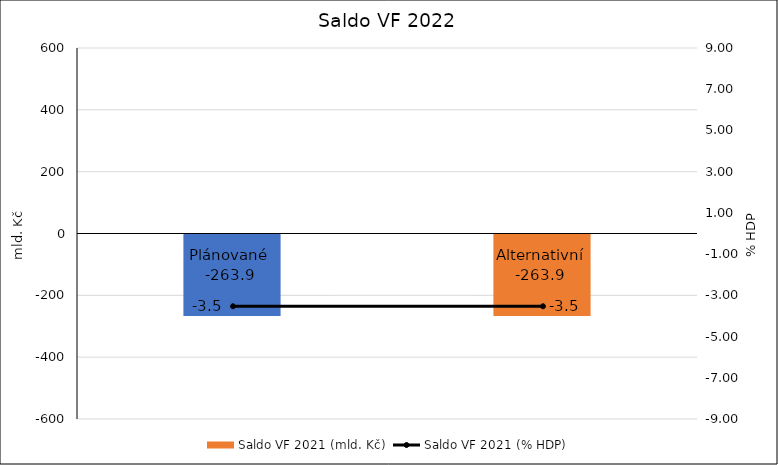
| Category | Saldo VF 2021 (mld. Kč) |
|---|---|
| Plánované  | -263.864 |
| Alternativní | -263.894 |